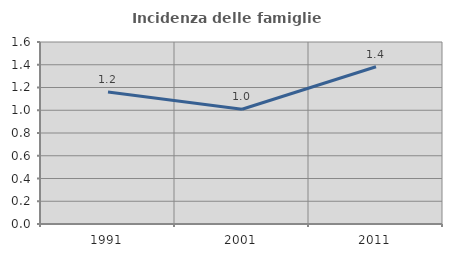
| Category | Incidenza delle famiglie numerose |
|---|---|
| 1991.0 | 1.161 |
| 2001.0 | 1.009 |
| 2011.0 | 1.382 |